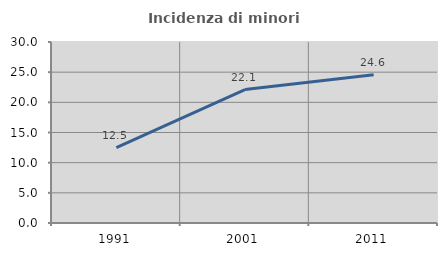
| Category | Incidenza di minori stranieri |
|---|---|
| 1991.0 | 12.5 |
| 2001.0 | 22.124 |
| 2011.0 | 24.578 |